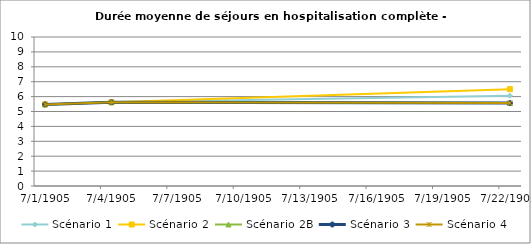
| Category | Scénario 1 | Scénario 2 | Scénario 2B | Scénario 3 | Scénario 4 |
|---|---|---|---|---|---|
| 2009.0 | 5.477 | 5.477 | 5.477 | 5.477 | 5.477 |
| 2012.0 | 5.622 | 5.622 | 5.622 | 5.622 | 5.622 |
| 2030.0 | 6.056 | 6.499 | 5.57 | 5.57 | 5.57 |